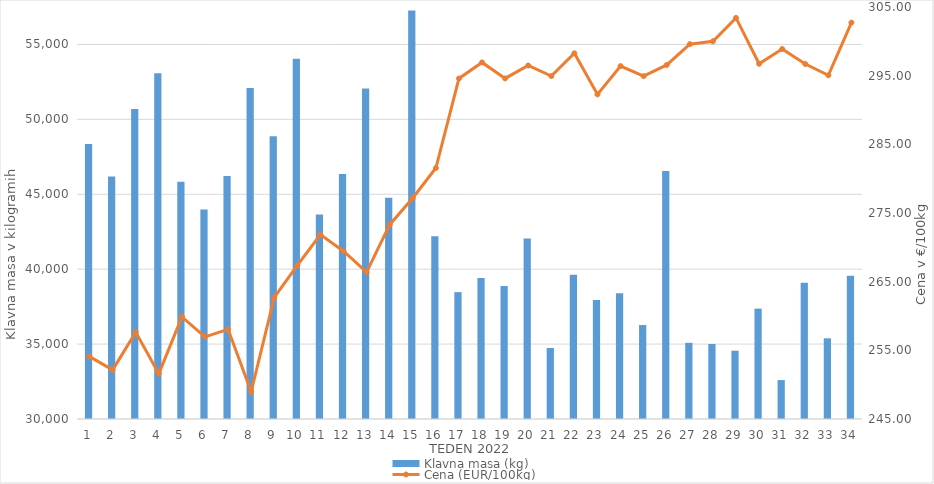
| Category | Klavna masa (kg) |
|---|---|
| 1.0 | 48349 |
| 2.0 | 46187 |
| 3.0 | 50692 |
| 4.0 | 53081 |
| 5.0 | 45844 |
| 6.0 | 43982 |
| 7.0 | 46227 |
| 8.0 | 52099 |
| 9.0 | 48872 |
| 10.0 | 54045 |
| 11.0 | 43645 |
| 12.0 | 46350 |
| 13.0 | 52061 |
| 14.0 | 44774 |
| 15.0 | 57268 |
| 16.0 | 42191 |
| 17.0 | 38469 |
| 18.0 | 39417 |
| 19.0 | 38876 |
| 20.0 | 42047 |
| 21.0 | 34739 |
| 22.0 | 39626 |
| 23.0 | 37939 |
| 24.0 | 38390 |
| 25.0 | 36272 |
| 26.0 | 46553 |
| 27.0 | 35085 |
| 28.0 | 35007 |
| 29.0 | 34559 |
| 30.0 | 37366 |
| 31.0 | 32599 |
| 32.0 | 39100 |
| 33.0 | 35388 |
| 34.0 | 39563 |